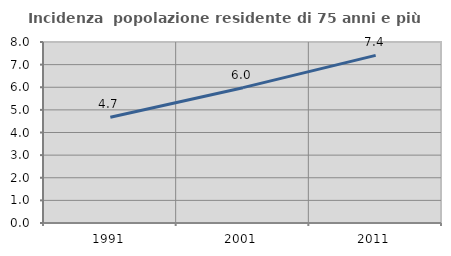
| Category | Incidenza  popolazione residente di 75 anni e più |
|---|---|
| 1991.0 | 4.67 |
| 2001.0 | 5.982 |
| 2011.0 | 7.407 |